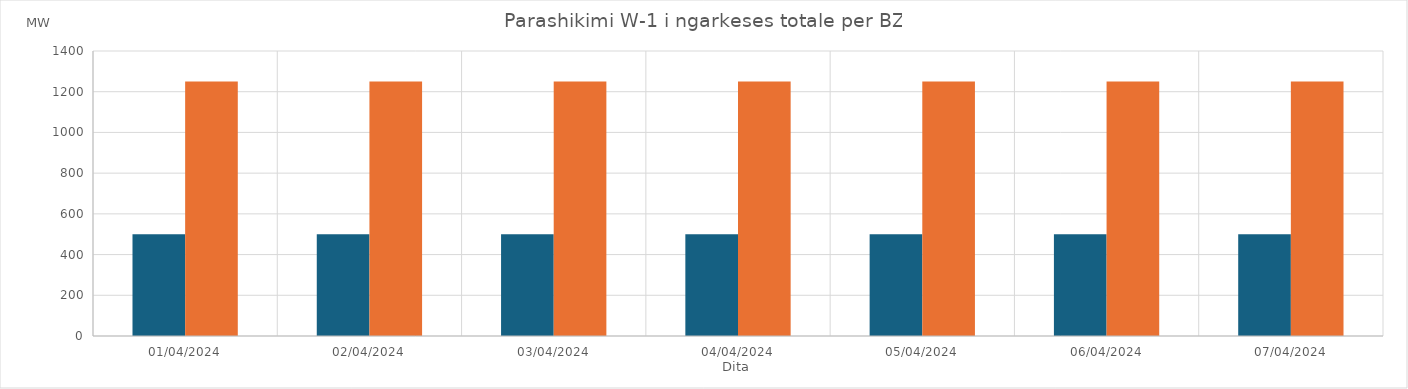
| Category | Min (MW) | Max (MW) |
|---|---|---|
| 01/04/2024 | 500 | 1250 |
| 02/04/2024 | 500 | 1250 |
| 03/04/2024 | 500 | 1250 |
| 04/04/2024 | 500 | 1250 |
| 05/04/2024 | 500 | 1250 |
| 06/04/2024 | 500 | 1250 |
| 07/04/2024 | 500 | 1250 |